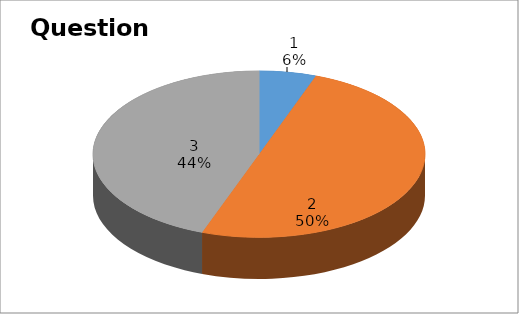
| Category | Series 0 |
|---|---|
| 0 | 1 |
| 1 | 9 |
| 2 | 8 |